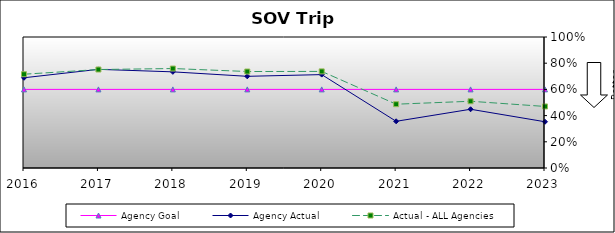
| Category | Agency Goal | Agency Actual | Actual - ALL Agencies |
|---|---|---|---|
| 2016.0 | 0.6 | 0.689 | 0.716 |
| 2017.0 | 0.6 | 0.753 | 0.752 |
| 2018.0 | 0.6 | 0.734 | 0.759 |
| 2019.0 | 0.6 | 0.7 | 0.736 |
| 2020.0 | 0.6 | 0.713 | 0.737 |
| 2021.0 | 0.6 | 0.356 | 0.487 |
| 2022.0 | 0.6 | 0.448 | 0.509 |
| 2023.0 | 0.6 | 0.353 | 0.47 |